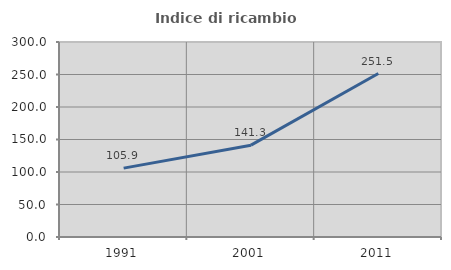
| Category | Indice di ricambio occupazionale  |
|---|---|
| 1991.0 | 105.946 |
| 2001.0 | 141.266 |
| 2011.0 | 251.531 |